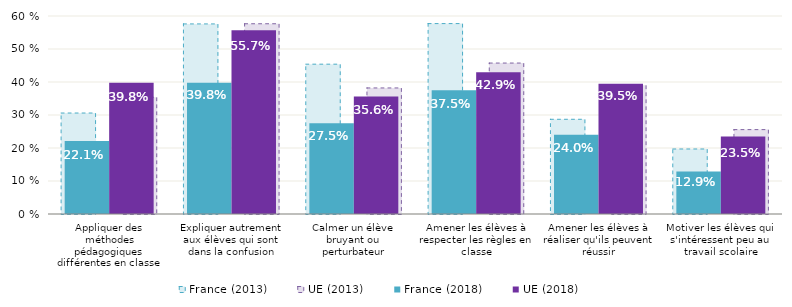
| Category | France (2013) | UE (2013) |
|---|---|---|
| Appliquer des méthodes pédagogiques différentes en classe | 0.306 | 0.354 |
| Expliquer autrement aux élèves qui sont dans la confusion | 0.576 | 0.576 |
| Calmer un élève bruyant ou perturbateur | 0.454 | 0.382 |
| Amener les élèves à respecter les règles en classe | 0.577 | 0.457 |
| Amener les élèves à réaliser qu'ils peuvent réussir | 0.287 | 0.39 |
| Motiver les élèves qui s'intéressent peu au travail scolaire | 0.197 | 0.256 |